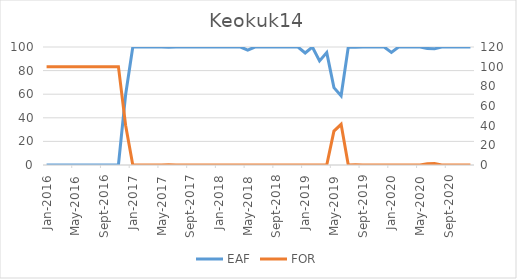
| Category | EAF |
|---|---|
| 2016-01-01 | 0 |
| 2016-02-01 | 0 |
| 2016-03-01 | 0 |
| 2016-04-01 | 0 |
| 2016-05-01 | 0 |
| 2016-06-01 | 0 |
| 2016-07-01 | 0 |
| 2016-08-01 | 0 |
| 2016-09-01 | 0 |
| 2016-10-01 | 0 |
| 2016-11-01 | 0 |
| 2016-12-01 | 59.54 |
| 2017-01-01 | 100 |
| 2017-02-01 | 100 |
| 2017-03-01 | 100 |
| 2017-04-01 | 100 |
| 2017-05-01 | 100 |
| 2017-06-01 | 99.87 |
| 2017-07-01 | 99.98 |
| 2017-08-01 | 100 |
| 2017-09-01 | 100 |
| 2017-10-01 | 100 |
| 2017-11-01 | 100 |
| 2017-12-01 | 100 |
| 2018-01-01 | 100 |
| 2018-02-01 | 100 |
| 2018-03-01 | 100 |
| 2018-04-01 | 100 |
| 2018-05-01 | 97.43 |
| 2018-06-01 | 100 |
| 2018-07-01 | 100 |
| 2018-08-01 | 100 |
| 2018-09-01 | 100 |
| 2018-10-01 | 100 |
| 2018-11-01 | 100 |
| 2018-12-01 | 99.97 |
| 2019-01-01 | 94.96 |
| 2019-02-01 | 100 |
| 2019-03-01 | 88.25 |
| 2019-04-01 | 95.24 |
| 2019-05-01 | 65.53 |
| 2019-06-01 | 58.63 |
| 2019-07-01 | 100 |
| 2019-08-01 | 99.72 |
| 2019-09-01 | 100 |
| 2019-10-01 | 100 |
| 2019-11-01 | 100 |
| 2019-12-01 | 100 |
| 2020-01-01 | 95.46 |
| 2020-02-01 | 100 |
| 2020-03-01 | 100 |
| 2020-04-01 | 100 |
| 2020-05-01 | 100 |
| 2020-06-01 | 98.74 |
| 2020-07-01 | 98.45 |
| 2020-08-01 | 100 |
| 2020-09-01 | 100 |
| 2020-10-01 | 100 |
| 2020-11-01 | 100 |
| 2020-12-01 | 100 |